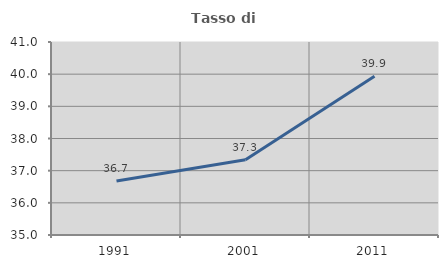
| Category | Tasso di occupazione   |
|---|---|
| 1991.0 | 36.678 |
| 2001.0 | 37.337 |
| 2011.0 | 39.933 |